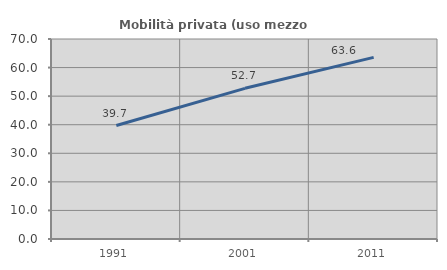
| Category | Mobilità privata (uso mezzo privato) |
|---|---|
| 1991.0 | 39.713 |
| 2001.0 | 52.733 |
| 2011.0 | 63.559 |